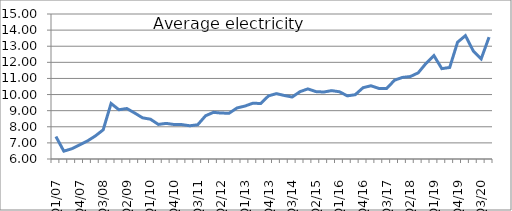
| Category | Series 0 |
|---|---|
| Q1/07  | 7.394 |
| Q2/07  | 6.487 |
| Q3/07  | 6.634 |
| Q4/07  | 6.874 |
| Q1/08  | 7.119 |
| Q2/08  | 7.429 |
| Q3/08  | 7.811 |
| Q4/08  | 9.445 |
| Q1/09  | 9.057 |
| Q2/09  | 9.134 |
| Q3/09  | 8.853 |
| Q4/09  | 8.556 |
| Q1/10  | 8.47 |
| Q2/10  | 8.146 |
| Q3/10  | 8.21 |
| Q4/10  | 8.142 |
| Q1/11  | 8.134 |
| Q2/11  | 8.063 |
| Q3/11  | 8.124 |
| Q4/11  | 8.684 |
| Q1/12  | 8.896 |
| Q2/12  | 8.849 |
| Q3/12  | 8.844 |
| Q4/12  | 9.169 |
| Q1/13  | 9.286 |
| Q2/13  | 9.461 |
| Q3/13  | 9.446 |
| Q4/13  | 9.919 |
| Q1/14  | 10.057 |
| Q2/14  | 9.942 |
| Q3/14  | 9.846 |
| Q4/14  | 10.183 |
| Q1/15  | 10.351 |
| Q2/15  | 10.183 |
| Q3/15  | 10.157 |
| Q4/15  | 10.244 |
| Q1/16  | 10.173 |
| Q2/16  | 9.92 |
| Q3/16  | 9.99 |
| Q4/16  | 10.426 |
| Q1/17  | 10.545 |
| Q2/17  | 10.382 |
| Q3/17  | 10.38 |
| Q4/17  | 10.892 |
| Q1/18  | 11.064 |
| Q2/18  | 11.118 |
| Q3/18  | 11.348 |
| Q4/18  | 11.939 |
| Q1/19  | 12.415 |
| Q2/19  | 11.609 |
| Q3/19  | 11.682 |
| Q4/19  | 13.249 |
| Q1/20  | 13.657 |
| Q2/20  | 12.7 |
| Q3/20  | 12.217 |
| Q4/20  | 13.565 |